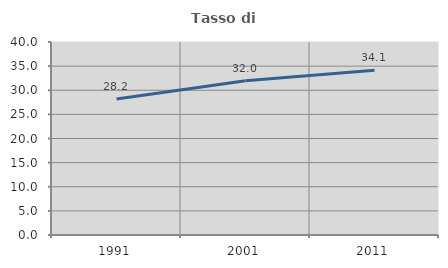
| Category | Tasso di occupazione   |
|---|---|
| 1991.0 | 28.208 |
| 2001.0 | 31.982 |
| 2011.0 | 34.141 |